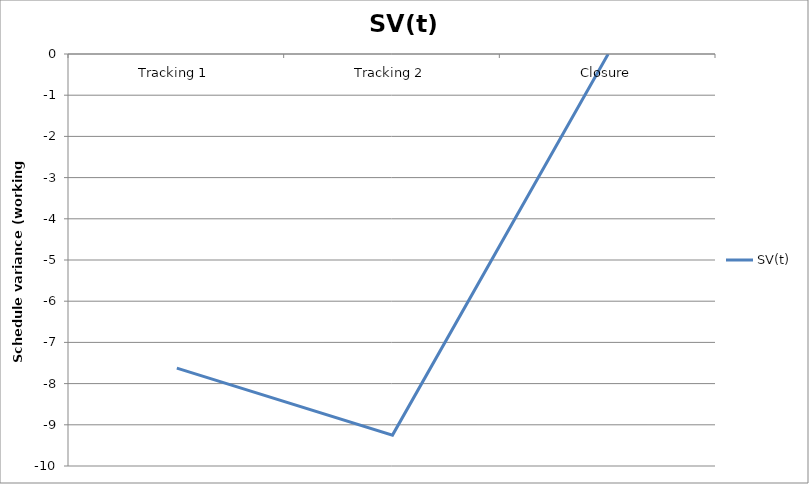
| Category | SV(t) |
|---|---|
| Tracking 1 | -7.625 |
| Tracking 2 | -9.25 |
| Closure | 0 |